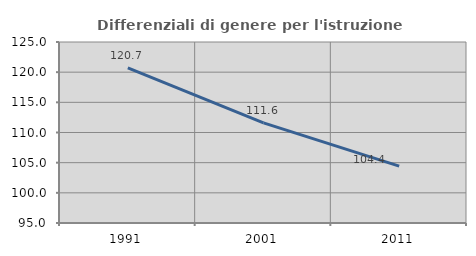
| Category | Differenziali di genere per l'istruzione superiore |
|---|---|
| 1991.0 | 120.728 |
| 2001.0 | 111.586 |
| 2011.0 | 104.431 |